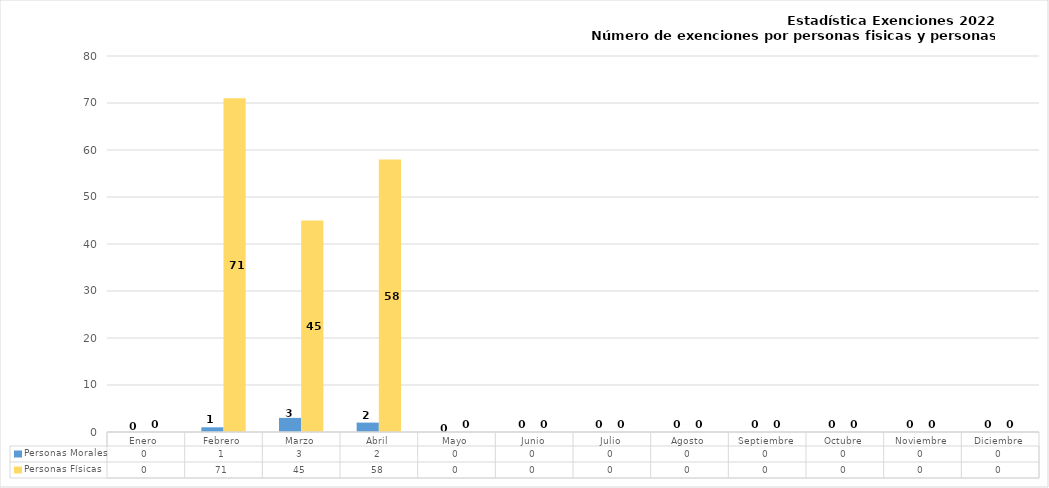
| Category | Personas Morales | Personas Físicas |
|---|---|---|
| Enero  | 0 | 0 |
| Febrero | 1 | 71 |
| Marzo | 3 | 45 |
| Abril | 2 | 58 |
| Mayo | 0 | 0 |
| Junio | 0 | 0 |
| Julio | 0 | 0 |
| Agosto | 0 | 0 |
| Septiembre | 0 | 0 |
| Octubre | 0 | 0 |
| Noviembre | 0 | 0 |
| Diciembre | 0 | 0 |